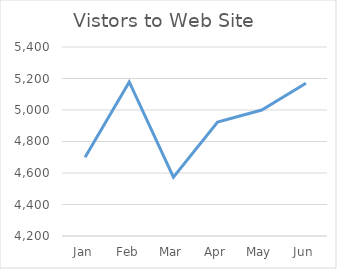
| Category | Vistors to Web Site |
|---|---|
| Jan | 4700 |
| Feb | 5178 |
| Mar | 4574 |
| Apr | 4923 |
| May | 5000 |
| Jun | 5170 |